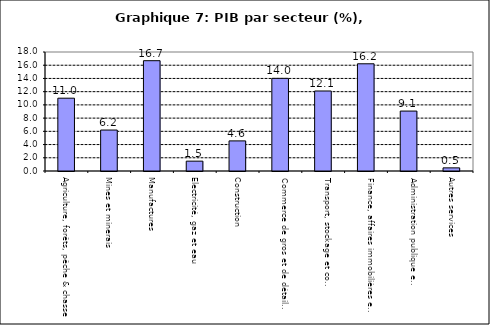
| Category | Series 0 |
|---|---|
| Agriculture, forêts, pêche & chasse | 11.011 |
| Mines et minerais | 6.196 |
| Manufactures | 16.686 |
| Electricité, gaz et eau | 1.491 |
| Construction | 4.554 |
| Commerce de gros et de détail, hôtels et restaurants | 14.013 |
| Transport, stockage et communications                | 12.103 |
| Finance, affaires immobilières et services | 16.216 |
| Administration publique et defense       | 9.066 |
| Autres services                        | 0.474 |